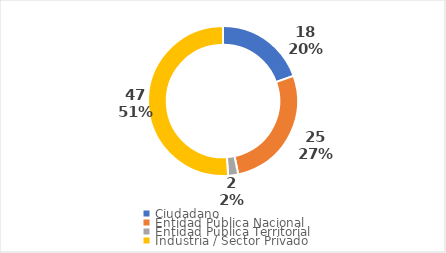
| Category | Cantidad |
|---|---|
| Ciudadano | 18 |
| Entidad Pública Nacional | 25 |
| Entidad Pública Territorial | 2 |
| Industria / Sector Privado | 47 |